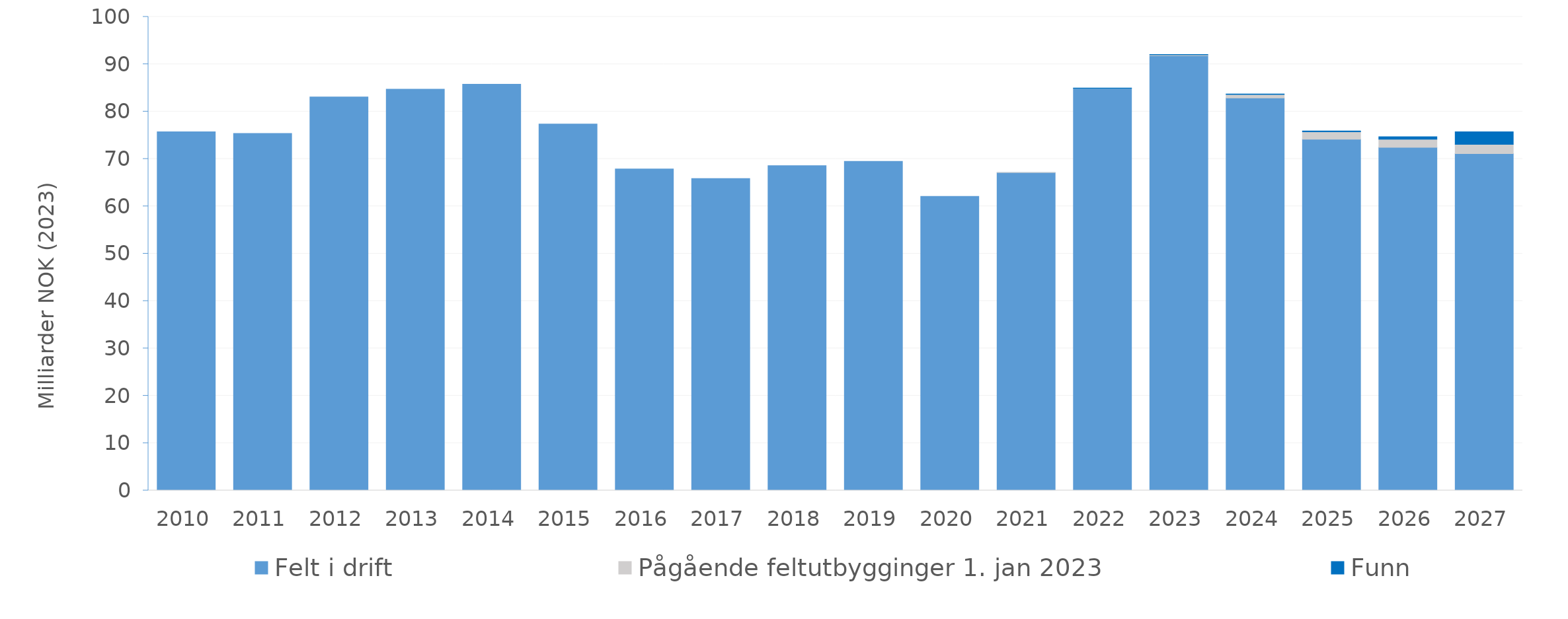
| Category | Felt i drift | Pågående feltutbygginger 1. jan 2023 | Funn |
|---|---|---|---|
| 2010.0 | 75.729 | 0 | 0 |
| 2011.0 | 75.4 | 0 | 0 |
| 2012.0 | 83.104 | 0 | 0 |
| 2013.0 | 84.722 | 0 | 0 |
| 2014.0 | 85.776 | 0 | 0 |
| 2015.0 | 77.354 | 0 | 0 |
| 2016.0 | 67.899 | 0 | 0 |
| 2017.0 | 65.857 | 0 | 0 |
| 2018.0 | 68.596 | 0 | 0 |
| 2019.0 | 69.501 | 0 | 0 |
| 2020.0 | 62.09 | 0 | 0 |
| 2021.0 | 67.104 | 0.002 | 0 |
| 2022.0 | 84.9 | 0.02 | 0.046 |
| 2023.0 | 91.791 | 0.197 | 0.077 |
| 2024.0 | 82.881 | 0.74 | 0.099 |
| 2025.0 | 74.172 | 1.572 | 0.154 |
| 2026.0 | 72.448 | 1.729 | 0.512 |
| 2027.0 | 71.124 | 1.942 | 2.67 |